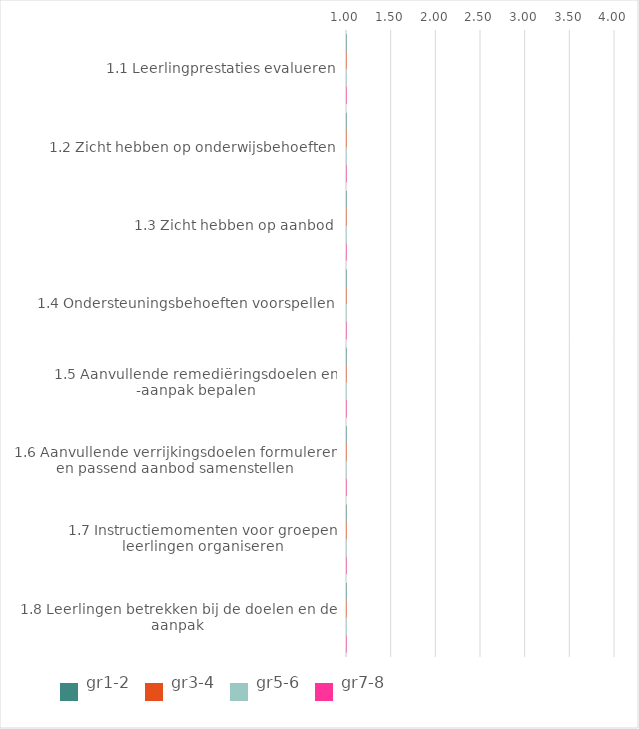
| Category | gr1-2 | gr3-4 | gr5-6 | gr7-8 |
|---|---|---|---|---|
| 1.1 Leerlingprestaties evalueren | 0 | 0 | 0 | 0 |
| 1.2 Zicht hebben op onderwijsbehoeften | 0 | 0 | 0 | 0 |
| 1.3 Zicht hebben op aanbod | 0 | 0 | 0 | 0 |
| 1.4 Ondersteuningsbehoeften voorspellen | 0 | 0 | 0 | 0 |
| 1.5 Aanvullende remediëringsdoelen en -aanpak bepalen | 0 | 0 | 0 | 0 |
| 1.6 Aanvullende verrijkingsdoelen formuleren en passend aanbod samenstellen | 0 | 0 | 0 | 0 |
| 1.7 Instructiemomenten voor groepen leerlingen organiseren | 0 | 0 | 0 | 0 |
| 1.8 Leerlingen betrekken bij de doelen en de aanpak | 0 | 0 | 0 | 0 |